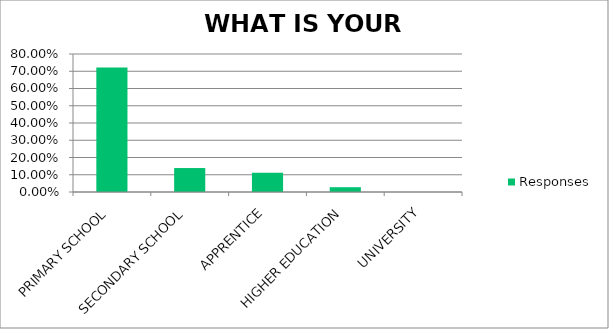
| Category | Responses |
|---|---|
| PRIMARY SCHOOL | 0.722 |
| SECONDARY SCHOOL | 0.139 |
| APPRENTICE | 0.111 |
| HIGHER EDUCATION | 0.028 |
| UNIVERSITY | 0 |